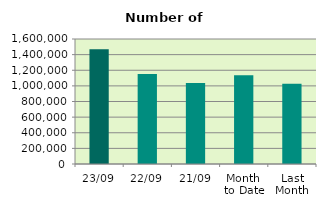
| Category | Series 0 |
|---|---|
| 23/09 | 1469694 |
| 22/09 | 1153584 |
| 21/09 | 1038078 |
| Month 
to Date | 1134531.059 |
| Last
Month | 1026775.304 |